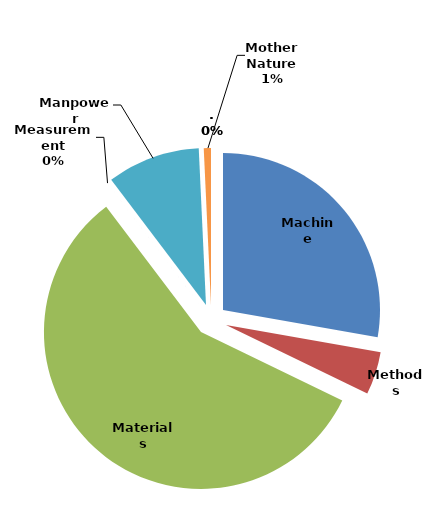
| Category | Series 0 |
|---|---|
| Machine | 0.278 |
| Methods | 0.044 |
| Materials | 0.575 |
| Measurement | 0 |
| Manpower | 0.096 |
| Mother Nature | 0.007 |
| . | 0 |
| . | 0 |